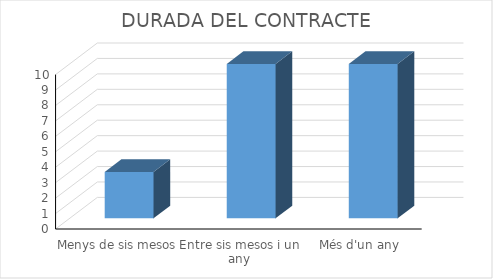
| Category | Series 0 |
|---|---|
| Menys de sis mesos | 3 |
| Entre sis mesos i un any | 10 |
| Més d'un any | 10 |